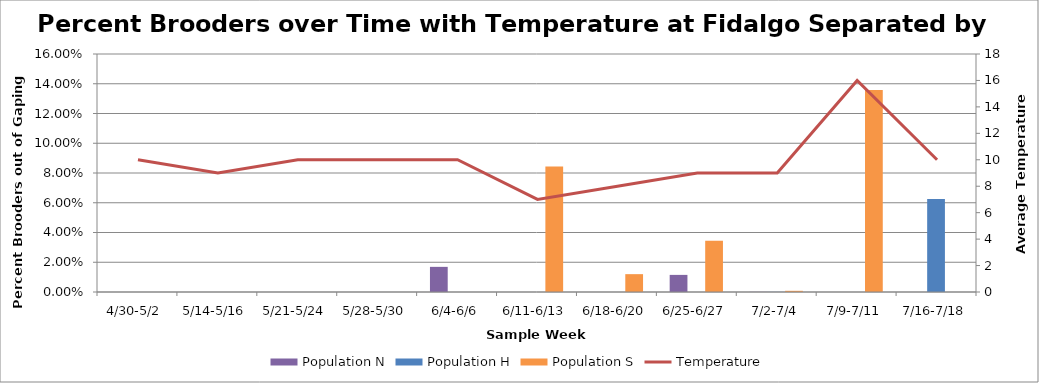
| Category | Population N | Population H | Population S |
|---|---|---|---|
| 4/30-5/2 | 0 | 0 | 0 |
| 5/14-5/16 | 0 | 0 | 0 |
| 5/21-5/24 | 0 | 0 | 0 |
| 5/28-5/30 | 0 | 0 | 0 |
| 6/4-6/6 | 0.017 | 0 | 0 |
| 6/11-6/13 | 0 | 0 | 0.084 |
| 6/18-6/20 | 0 | 0 | 0.012 |
| 6/25-6/27 | 0.012 | 0 | 0.034 |
| 7/2-7/4 | 0 | 0 | 0.001 |
| 7/9-7/11 | 0 | 0 | 0.136 |
| 7/16-7/18 | 0 | 0.062 | 0 |